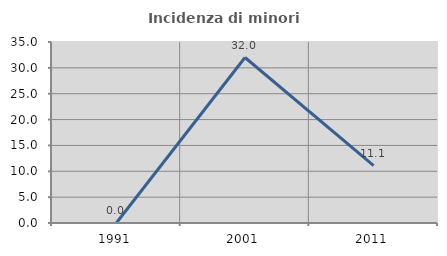
| Category | Incidenza di minori stranieri |
|---|---|
| 1991.0 | 0 |
| 2001.0 | 32 |
| 2011.0 | 11.111 |